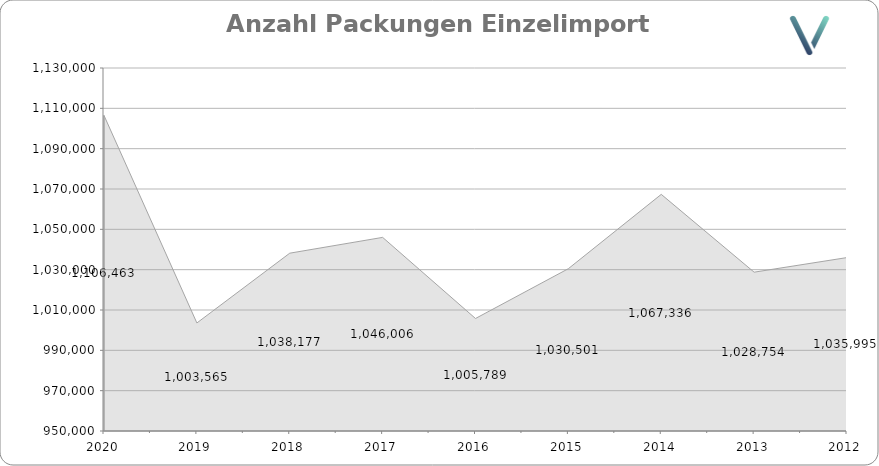
| Category | Anzahl |
|---|---|
| 2020.0 | 1106463 |
| 2019.0 | 1003565 |
| 2018.0 | 1038177 |
| 2017.0 | 1046006 |
| 2016.0 | 1005789 |
| 2015.0 | 1030501 |
| 2014.0 | 1067336 |
| 2013.0 | 1028754 |
| 2012.0 | 1035995 |